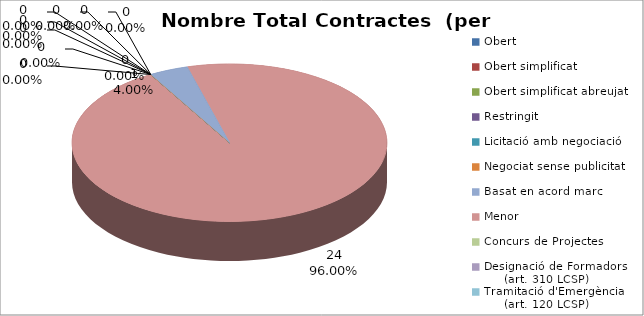
| Category | Nombre Total Contractes |
|---|---|
| Obert | 0 |
| Obert simplificat | 0 |
| Obert simplificat abreujat | 0 |
| Restringit | 0 |
| Licitació amb negociació | 0 |
| Negociat sense publicitat | 0 |
| Basat en acord marc | 1 |
| Menor | 24 |
| Concurs de Projectes | 0 |
| Designació de Formadors
     (art. 310 LCSP) | 0 |
| Tramitació d'Emergència
     (art. 120 LCSP) | 0 |